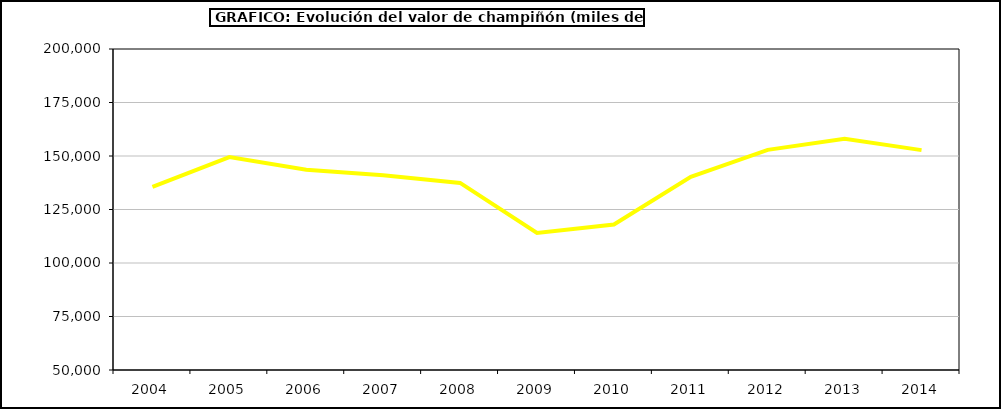
| Category | Valor |
|---|---|
| 2004.0 | 135600.696 |
| 2005.0 | 149500.718 |
| 2006.0 | 143535.505 |
| 2007.0 | 141006.375 |
| 2008.0 | 137424.559 |
| 2009.0 | 114028.006 |
| 2010.0 | 117998.554 |
| 2011.0 | 140234.857 |
| 2012.0 | 152884.195 |
| 2013.0 | 158028.957 |
| 2014.0 | 152745.292 |